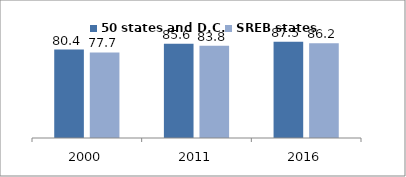
| Category | 50 states and D.C. | SREB states |
|---|---|---|
| 2000.0 | 80.399 | 77.731 |
| 2011.0 | 85.619 | 83.82 |
| 2016.0 | 87.453 | 86.166 |